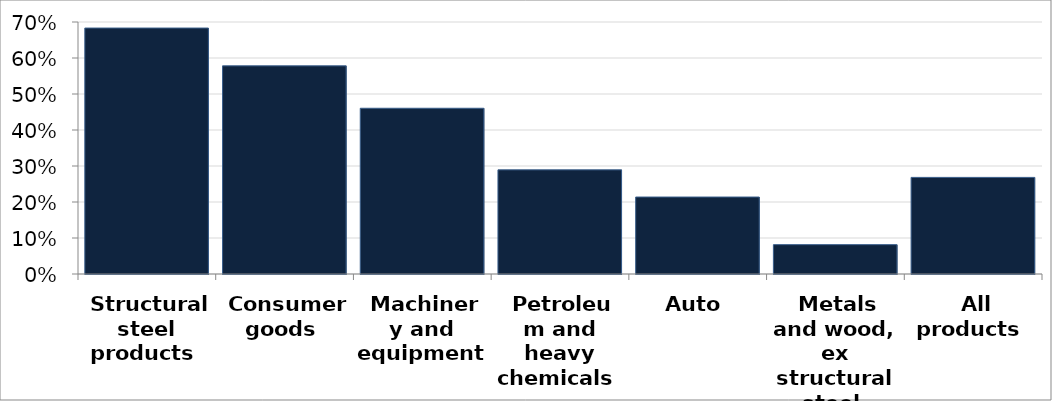
| Category | % of SA total exports |
|---|---|
| Structural steel products | 0.683 |
| Consumer goods | 0.578 |
| Machinery and equipment | 0.46 |
| Petroleum and heavy chemicals | 0.289 |
| Auto | 0.214 |
| Metals and wood, ex structural steel | 0.082 |
| All products | 0.268 |